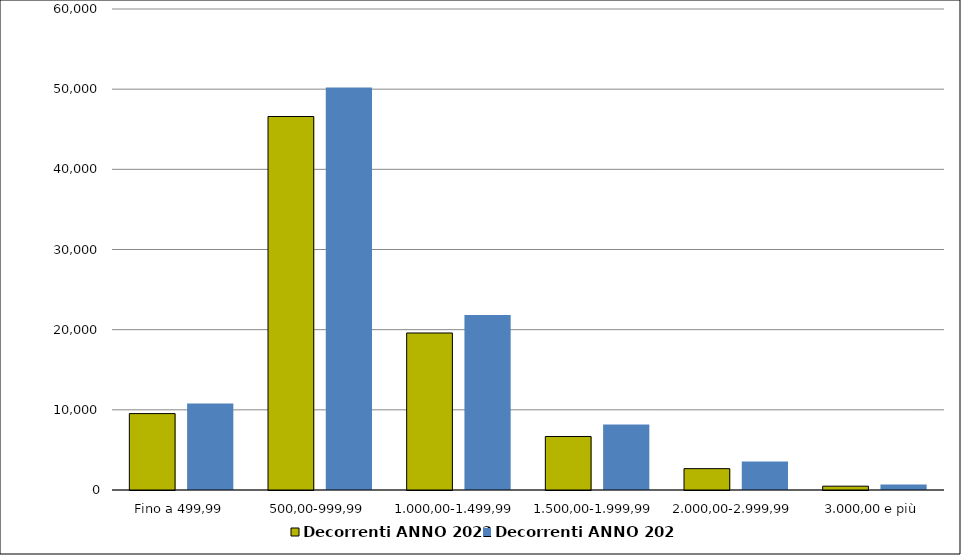
| Category | Decorrenti ANNO 2022 | Decorrenti ANNO 2021 |
|---|---|---|
|  Fino a 499,99  | 9529 | 10799 |
|  500,00-999,99  | 46590 | 50202 |
|  1.000,00-1.499,99  | 19585 | 21817 |
|  1.500,00-1.999,99  | 6675 | 8183 |
|  2.000,00-2.999,99  | 2663 | 3553 |
|  3.000,00 e più  | 477 | 680 |